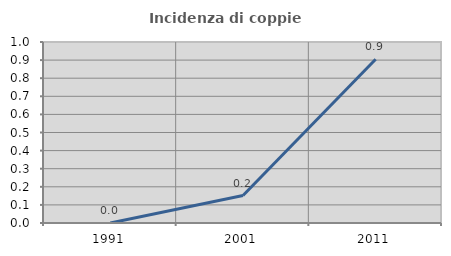
| Category | Incidenza di coppie miste |
|---|---|
| 1991.0 | 0 |
| 2001.0 | 0.152 |
| 2011.0 | 0.905 |